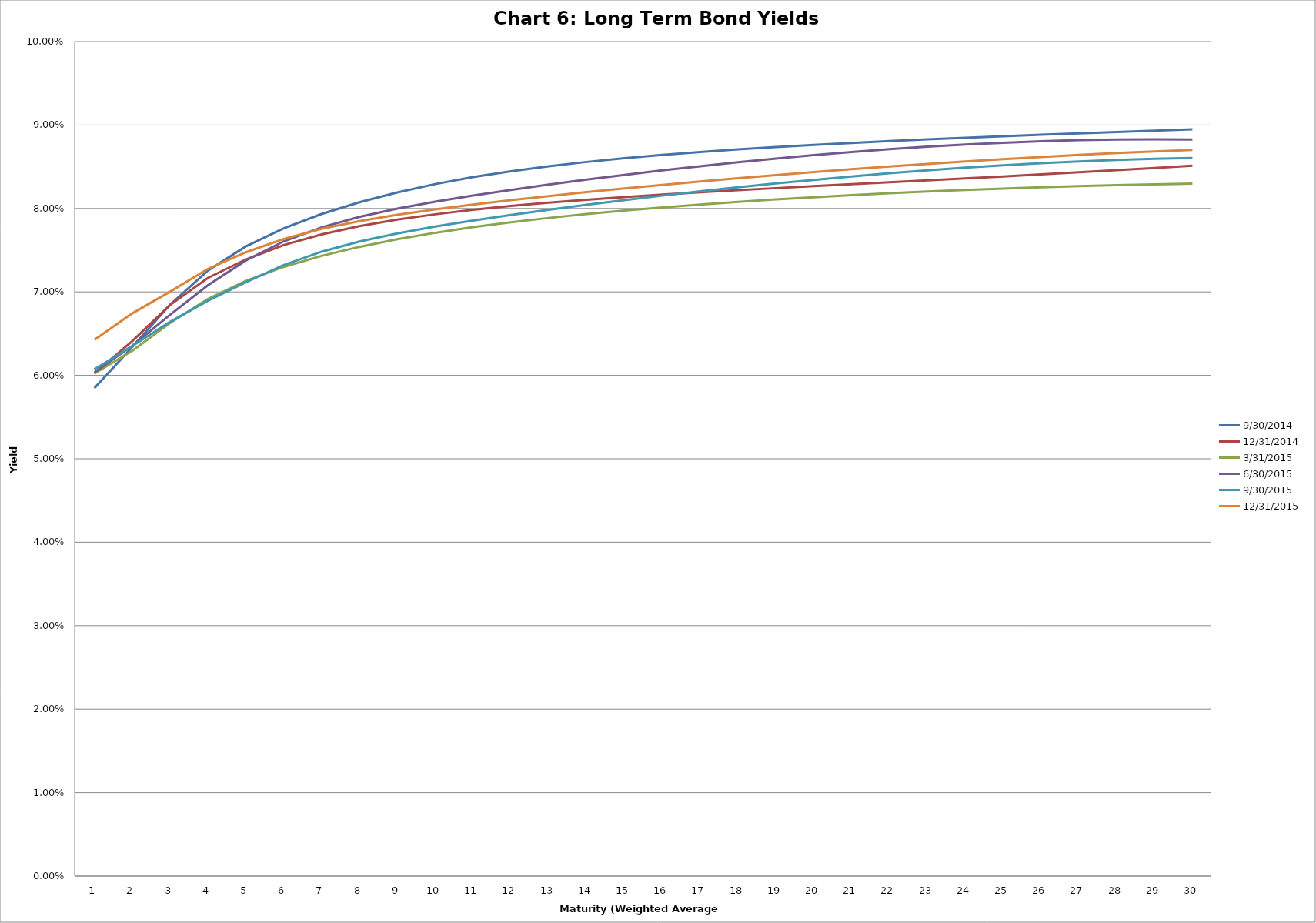
| Category | 9/30/2014 | 12/31/2014 | 3/31/2015 | 6/30/2015 | 9/30/2015 | 12/31/2015 |
|---|---|---|---|---|---|---|
| 0 | 0.058 | 0.06 | 0.06 | 0.06 | 0.061 | 0.064 |
| 1 | 0.063 | 0.064 | 0.063 | 0.064 | 0.064 | 0.067 |
| 2 | 0.068 | 0.068 | 0.066 | 0.067 | 0.066 | 0.07 |
| 3 | 0.073 | 0.072 | 0.069 | 0.071 | 0.069 | 0.073 |
| 4 | 0.075 | 0.074 | 0.071 | 0.074 | 0.071 | 0.075 |
| 5 | 0.078 | 0.076 | 0.073 | 0.076 | 0.073 | 0.076 |
| 6 | 0.079 | 0.077 | 0.074 | 0.078 | 0.075 | 0.078 |
| 7 | 0.081 | 0.078 | 0.075 | 0.079 | 0.076 | 0.078 |
| 8 | 0.082 | 0.079 | 0.076 | 0.08 | 0.077 | 0.079 |
| 9 | 0.083 | 0.079 | 0.077 | 0.081 | 0.078 | 0.08 |
| 10 | 0.084 | 0.08 | 0.078 | 0.082 | 0.079 | 0.08 |
| 11 | 0.084 | 0.08 | 0.078 | 0.082 | 0.079 | 0.081 |
| 12 | 0.085 | 0.081 | 0.079 | 0.083 | 0.08 | 0.081 |
| 13 | 0.086 | 0.081 | 0.079 | 0.083 | 0.08 | 0.082 |
| 14 | 0.086 | 0.081 | 0.08 | 0.084 | 0.081 | 0.082 |
| 15 | 0.086 | 0.082 | 0.08 | 0.085 | 0.082 | 0.083 |
| 16 | 0.087 | 0.082 | 0.08 | 0.085 | 0.082 | 0.083 |
| 17 | 0.087 | 0.082 | 0.081 | 0.086 | 0.083 | 0.084 |
| 18 | 0.087 | 0.082 | 0.081 | 0.086 | 0.083 | 0.084 |
| 19 | 0.088 | 0.083 | 0.081 | 0.086 | 0.083 | 0.084 |
| 20 | 0.088 | 0.083 | 0.082 | 0.087 | 0.084 | 0.085 |
| 21 | 0.088 | 0.083 | 0.082 | 0.087 | 0.084 | 0.085 |
| 22 | 0.088 | 0.083 | 0.082 | 0.087 | 0.085 | 0.085 |
| 23 | 0.088 | 0.084 | 0.082 | 0.088 | 0.085 | 0.086 |
| 24 | 0.089 | 0.084 | 0.082 | 0.088 | 0.085 | 0.086 |
| 25 | 0.089 | 0.084 | 0.083 | 0.088 | 0.085 | 0.086 |
| 26 | 0.089 | 0.084 | 0.083 | 0.088 | 0.086 | 0.086 |
| 27 | 0.089 | 0.085 | 0.083 | 0.088 | 0.086 | 0.087 |
| 28 | 0.089 | 0.085 | 0.083 | 0.088 | 0.086 | 0.087 |
| 29 | 0.089 | 0.085 | 0.083 | 0.088 | 0.086 | 0.087 |